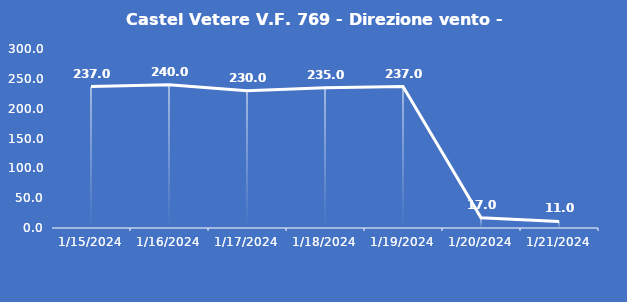
| Category | Castel Vetere V.F. 769 - Direzione vento - Grezzo (°N) |
|---|---|
| 1/15/24 | 237 |
| 1/16/24 | 240 |
| 1/17/24 | 230 |
| 1/18/24 | 235 |
| 1/19/24 | 237 |
| 1/20/24 | 17 |
| 1/21/24 | 11 |